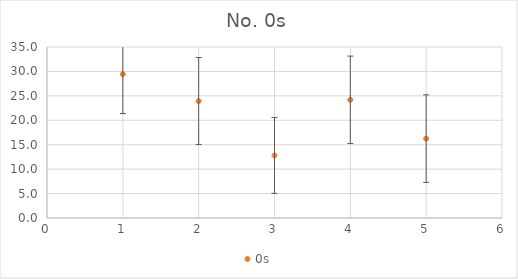
| Category | 0s |
|---|---|
| 0 | 29.438 |
| 1 | 23.938 |
| 2 | 12.8 |
| 3 | 24.2 |
| 4 | 16.25 |